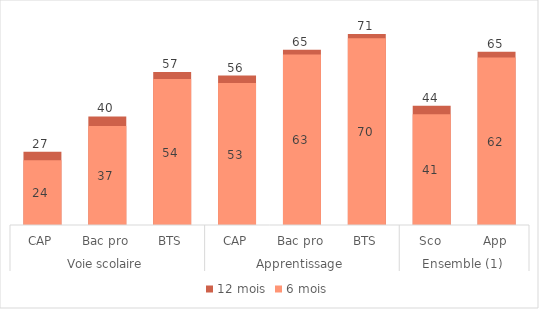
| Category | 12 mois | 6 mois |
|---|---|---|
| 0 | 27.3 | 24.1 |
| 1 | 40.4 | 36.8 |
| 2 | 56.9 | 54.3 |
| 3 | 55.6 | 52.8 |
| 4 | 65.2 | 63.4 |
| 5 | 71.1 | 69.5 |
| 6 | 44.4 | 41.2 |
| 7 | 64.5 | 62.3 |